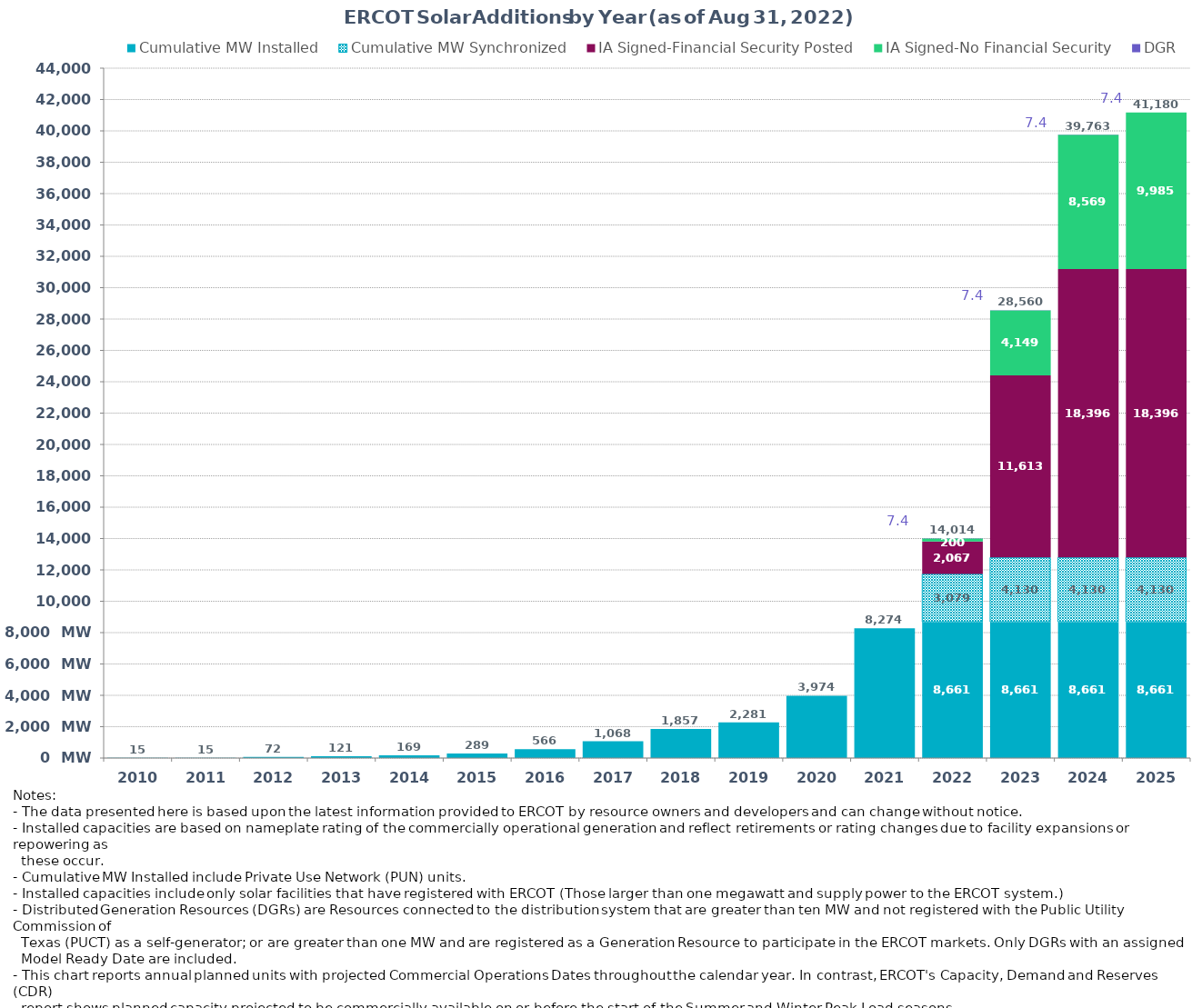
| Category | Cumulative MW Installed | Cumulative MW Synchronized | IA Signed-Financial Security Posted  | IA Signed-No Financial Security  | DGR | Cumulative Installed and Planned |
|---|---|---|---|---|---|---|
| 2010.0 | 15 | 0 | 0 | 0 | 0 | 15 |
| 2011.0 | 15 | 0 | 0 | 0 | 0 | 15 |
| 2012.0 | 72.3 | 0 | 0 | 0 | 0 | 72.3 |
| 2013.0 | 121.2 | 0 | 0 | 0 | 0 | 121.2 |
| 2014.0 | 168.7 | 0 | 0 | 0 | 0 | 168.7 |
| 2015.0 | 289.28 | 0 | 0 | 0 | 0 | 289.28 |
| 2016.0 | 565.78 | 0 | 0 | 0 | 0 | 565.78 |
| 2017.0 | 1067.78 | 0 | 0 | 0 | 0 | 1067.78 |
| 2018.0 | 1856.78 | 0 | 0 | 0 | 0 | 1856.78 |
| 2019.0 | 2281.38 | 0 | 0 | 0 | 0 | 2281.38 |
| 2020.0 | 3973.5 | 0 | 0 | 0 | 0 | 3973.5 |
| 2021.0 | 8273.55 | 0 | 0 | 0 | 0 | 8273.55 |
| 2022.0 | 8660.95 | 3078.56 | 2067.37 | 200 | 7.4 | 14014.28 |
| 2023.0 | 8660.95 | 4129.98 | 11612.79 | 4149.35 | 7.4 | 28560.47 |
| 2024.0 | 8660.95 | 4129.98 | 18395.8 | 8568.83 | 7.4 | 39762.96 |
| 2025.0 | 8660.95 | 4129.98 | 18395.8 | 9985.38 | 7.4 | 41179.51 |